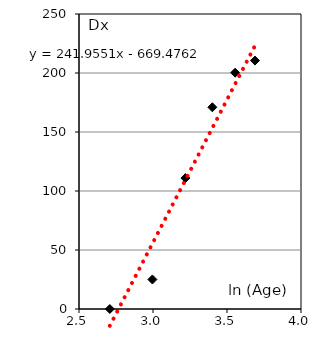
| Category | Series 0 |
|---|---|
| 2.708 | 0 |
| 2.996 | 25.02 |
| 3.219 | 110.95 |
| 3.401 | 170.96 |
| 3.555 | 200.26 |
| 3.689 | 210.53 |